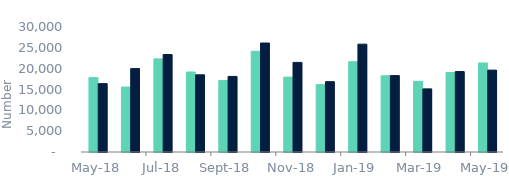
| Category | Full market | Remortgage No Equity Withdrawn |
|---|---|---|
| 2018-05-01 | 17840 | 16410 |
| 2018-06-01 | 15590 | 20020 |
| 2018-07-01 | 22350 | 23390 |
| 2018-08-01 | 19200 | 18530 |
| 2018-09-01 | 17140 | 18140 |
| 2018-10-01 | 24170 | 26160 |
| 2018-11-01 | 17970 | 21510 |
| 2018-12-01 | 16170 | 16880 |
| 2019-01-01 | 21660 | 25880 |
| 2019-02-01 | 18290 | 18340 |
| 2019-03-01 | 16970 | 15150 |
| 2019-04-01 | 19070 | 19310 |
| 2019-05-01 | 21370 | 19650 |